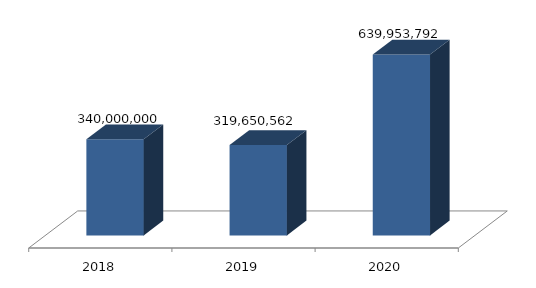
| Category | Series 0 |
|---|---|
| 0 | 340000000 |
| 1 | 319650562 |
| 2 | 639953792 |